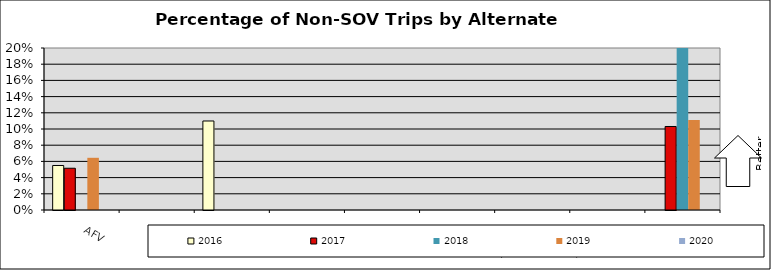
| Category | 2016 | 2017 | 2018 | 2019 | 2020 |
|---|---|---|---|---|---|
| AFV | 0.055 | 0.052 | 0 | 0.064 | 0 |
| Bicycle | 0 | 0 | 0 | 0 | 0 |
| Bus | 0.11 | 0 | 0 | 0 | 0 |
| Carpool | 0 | 0 | 0 | 0 | 0 |
| CWW | 0 | 0 | 0 | 0 | 0 |
| Light Rail | 0 | 0 | 0 | 0 | 0 |
| Telework | 0 | 0 | 0 | 0 | 0 |
| Vanpool | 0 | 0 | 0 | 0 | 0 |
| Walk | 0 | 0.103 | 0.333 | 0.111 | 0 |